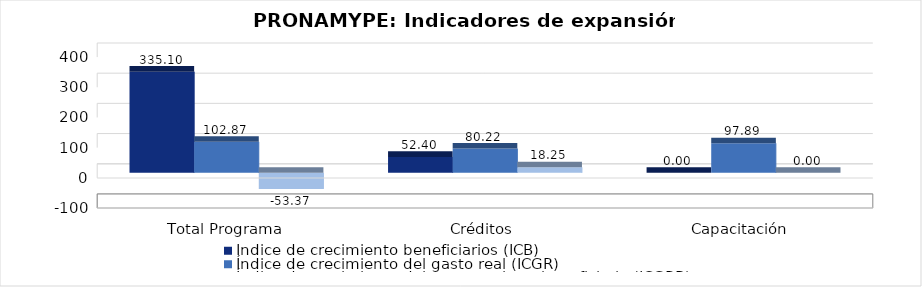
| Category | Índice de crecimiento beneficiarios (ICB)  | Índice de crecimiento del gasto real (ICGR)  | Índice de crecimiento del gasto real por beneficiario (ICGRB)  |
|---|---|---|---|
| Total Programa | 335.096 | 102.872 | -53.373 |
| Créditos  | 52.404 | 80.22 | 18.252 |
| Capacitación  | 0 | 97.894 | 0 |